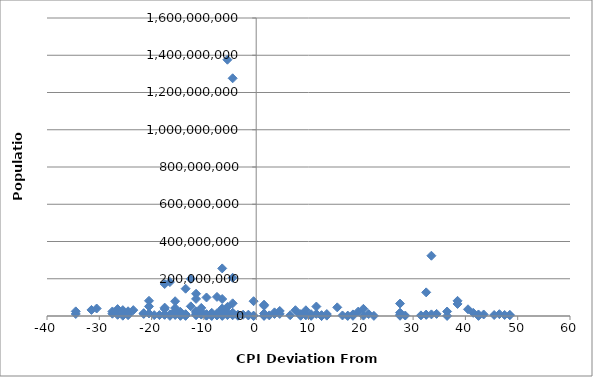
| Category | Population |
|---|---|
| 48.5 | 5707251 |
| 47.5 | 5488543 |
| 46.5 | 9875378 |
| 48.5 | 4691480 |
| 41.5 | 17000059 |
| 45.5 | 5214900 |
| 43.5 | 8211700 |
| 42.5 | 8211700 |
| 40.5 | 36048521 |
| 38.5 | 81459000 |
| 42.5 | 562958 |
| 38.5 | 64716000 |
| 36.5 | 24104700 |
| 36.5 | 332529 |
| 34.5 | 11250585 |
| 33.5 | 8662588 |
| 33.5 | 323625762 |
| 32.5 | 7234800 |
| 32.5 | 6378000 |
| 32.5 | 126919659 |
| 31.5 | 3324460 |
| 28.5 | 2545603 |
| 27.5 | 18006407 |
| 27.5 | 1315944 |
| 27.5 | 66689000 |
| 27.5 | 5779760 |
| 22.5 | 742737 |
| 20.5 | 2155784 |
| 21.5 | 10427301 |
| 20.5 | 38483957 |
| 19.5 | 23476640 |
| 18.5 | 1141166 |
| 18.5 | 8502900 |
| 16.5 | 2875593 |
| 17.5 | 2063077 |
| 15.5 | 46423064 |
| 13.5 | 10553443 |
| 11.5 | 50801405 |
| 17.5 | 445426 |
| 12.5 | 525000 |
| 12.5 | 4586353 |
| 13.5 | 1973700 |
| 12.5 | 92000 |
| 11.5 | 11262564 |
| 10.5 | 9531712 |
| 10.5 | 1261208 |
| 10.5 | 2113077 |
| 9.5 | 3720400 |
| 9.5 | 30770375 |
| 8.5 | 1343000 |
| 8.5 | 4284889 |
| 8.5 | 9855571 |
| 8.5 | 5426252 |
| 7.5 | 31068000 |
| 6.5 | 4187161 |
| 4.5 | 11238317 |
| 4.5 | 27000000 |
| 3.5 | 10955000 |
| 3.5 | 19511000 |
| 2.5 | 3286936 |
| 1.5 | 60674003 |
| 1.5 | 2067000 |
| 1.5 | 676872 |
| 1.5 | 13567338 |
| 1.5 | 54956900 |
| -0.5 | 190428 |
| -0.5 | 2069162 |
| -0.5 | 79463663 |
| -1.5 | 7202198 |
| -1.5 | 2950210 |
| -2.5 | 7041599 |
| -3.5 | 6377195 |
| -3.5 | 3081677 |
| -3.5 | 3929141 |
| -3.5 | 1349667 |
| -4.5 | 3871643 |
| -4.5 | 205338000 |
| -4.5 | 17322796 |
| -4.5 | 1276267000 |
| -4.5 | 67959000 |
| -4.5 | 10982754 |
| -4.5 | 16212000 |
| -5.5 | 10879829 |
| -5.5 | 1376049000 |
| -5.5 | 48663285 |
| -5.5 | 4503000 |
| -5.5 | 20277597 |
| -6.5 | 2886026 |
| -6.5 | 40400000 |
| -6.5 | 91162000 |
| -6.5 | 255461700 |
| -6.5 | 33848242 |
| -6.5 | 31151643 |
| -6.5 | 573311 |
| -7.5 | 2998600 |
| -7.5 | 14517176 |
| -11.5 | 119530753 |
| -7.5 | 102580000 |
| -8.5 | 11410651 |
| -8.5 | 828324 |
| -8.5 | 1475000 |
| -8.5 | 17138707 |
| -9.5 | 9980243 |
| -9.5 | 99465819 |
| -9.5 | 1859203 |
| -9.5 | 2913281 |
| -10.5 | 43417000 |
| -10.5 | 9498700 |
| -10.5 | 23919000 |
| -10.5 | 16144000 |
| -10.5 | 7552318 |
| -11.5 | 8249574 |
| -11.5 | 16407000 |
| -11.5 | 4067564 |
| -11.5 | 24692144 |
| -11.5 | 91700000 |
| -12.5 | 199085847 |
| -12.5 | 51820000 |
| -13.5 | 9754830 |
| -13.5 | 735554 |
| -13.5 | 146600000 |
| -13.5 | 6190280 |
| -14.5 | 1882450 |
| -14.5 | 15806675 |
| -14.5 | 17693500 |
| -14.5 | 6000000 |
| -14.5 | 4467000 |
| -14.5 | 22434363 |
| -14.5 | 1201542 |
| -15.5 | 22534532 |
| -15.5 | 79200000 |
| -15.5 | 26494504 |
| -15.5 | 6167237 |
| -15.5 | 6783272 |
| -15.5 | 42539010 |
| -16.5 | 798000 |
| -16.5 | 182202000 |
| -16.5 | 8610000 |
| -17.5 | 171700000 |
| -17.5 | 8746128 |
| -17.5 | 45010056 |
| -17.5 | 6803699 |
| -17.5 | 7059653 |
| -17.5 | 37873253 |
| -18.5 | 4709000 |
| -19.5 | 4662446 |
| -20.5 | 13670084 |
| -20.5 | 81680000 |
| -20.5 | 51486253 |
| -21.5 | 11178921 |
| -21.5 | 15458332 |
| -21.5 | 12973808 |
| -23.5 | 31576400 |
| -24.5 | 6380803 |
| -24.5 | 17064854 |
| -24.5 | 5171943 |
| -24.5 | 25408000 |
| -25.5 | 10604000 |
| -25.5 | 1693398 |
| -25.5 | 31416000 |
| -26.5 | 37056169 |
| -26.5 | 6411776 |
| -27.5 | 24383301 |
| -27.5 | 12340000 |
| -30.5 | 40235000 |
| -31.5 | 32564342 |
| -34.5 | 24895000 |
| -34.5 | 10816143 |